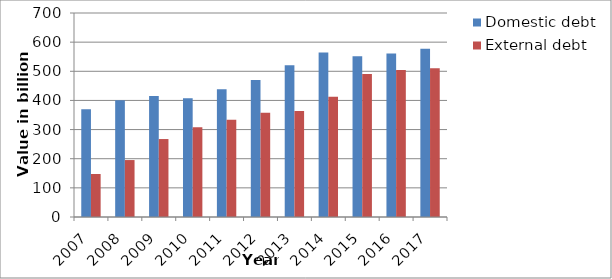
| Category | Domestic debt | External debt |
|---|---|---|
| 2007.0 | 369.5 | 147.5 |
| 2008.0 | 400.4 | 195.4 |
| 2009.0 | 415 | 267.5 |
| 2010.0 | 407.3 | 307.9 |
| 2011.0 | 438.5 | 333.9 |
| 2012.0 | 470.3 | 357.6 |
| 2013.0 | 520.7 | 363.9 |
| 2014.0 | 564.6 | 412.4 |
| 2015.0 | 551.3 | 490.8 |
| 2016.0 | 561.1 | 504.5 |
| 2017.0 | 577 | 510.2 |